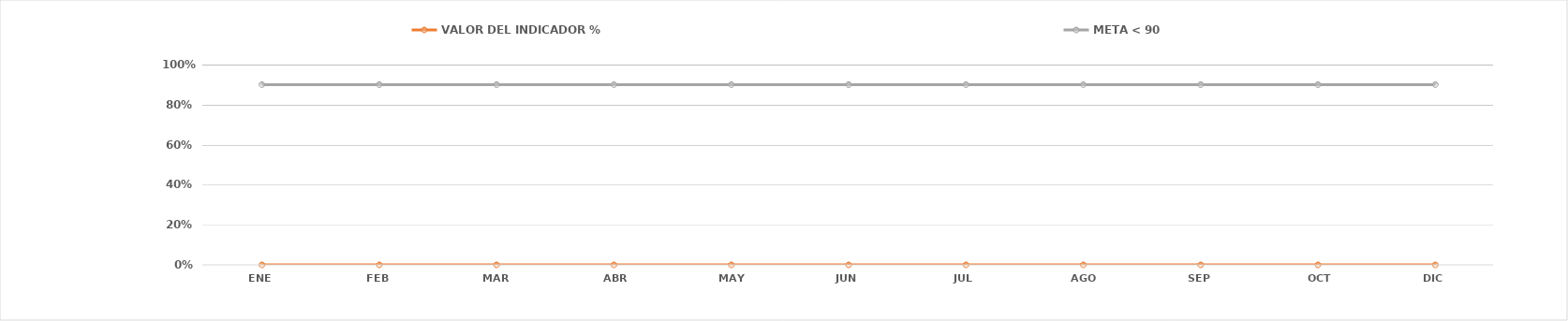
| Category | VALOR DEL INDICADOR % | META < 90 |
|---|---|---|
| ENE | 0 | 0.9 |
| FEB | 0 | 0.9 |
| MAR | 0 | 0.9 |
| ABR | 0 | 0.9 |
| MAY | 0 | 0.9 |
| JUN | 0 | 0.9 |
| JUL | 0 | 0.9 |
| AGO | 0 | 0.9 |
| SEP | 0 | 0.9 |
| OCT | 0 | 0.9 |
| DIC | 0 | 0.9 |